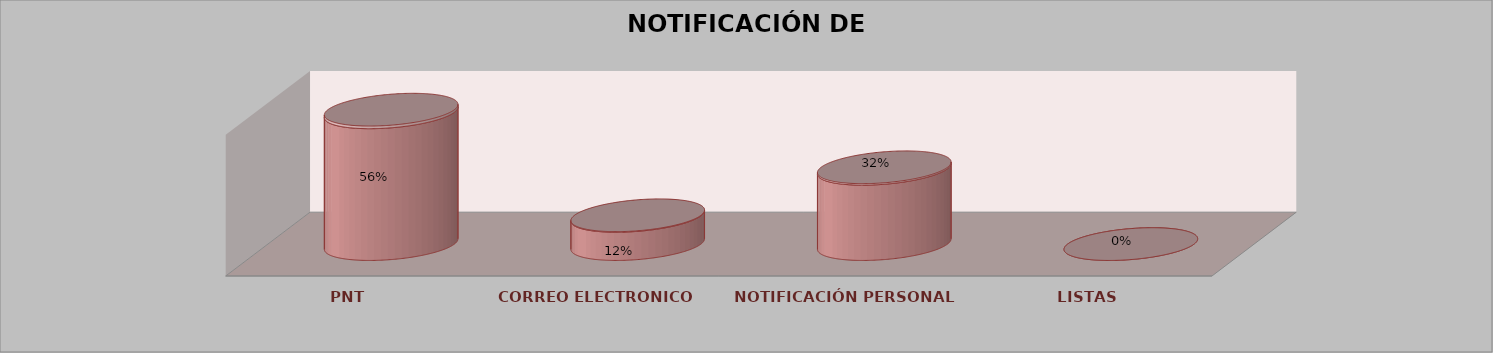
| Category | Series 0 | Series 1 | Series 2 | Series 3 | Series 4 |
|---|---|---|---|---|---|
| PNT |  |  |  | 28 | 0.56 |
| CORREO ELECTRONICO |  |  |  | 6 | 0.12 |
| NOTIFICACIÓN PERSONAL |  |  |  | 16 | 0.32 |
| LISTAS |  |  |  | 0 | 0 |